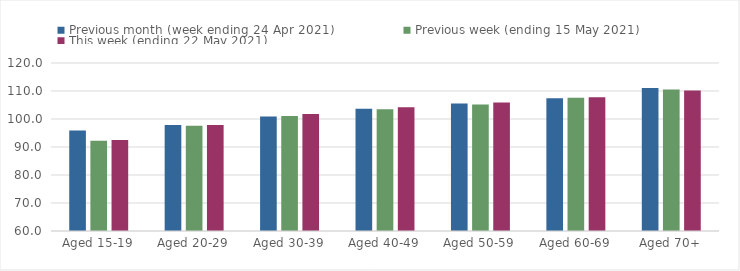
| Category | Previous month (week ending 24 Apr 2021) | Previous week (ending 15 May 2021) | This week (ending 22 May 2021) |
|---|---|---|---|
| Aged 15-19 | 95.92 | 92.24 | 92.48 |
| Aged 20-29 | 97.87 | 97.61 | 97.9 |
| Aged 30-39 | 100.9 | 101.09 | 101.81 |
| Aged 40-49 | 103.68 | 103.51 | 104.24 |
| Aged 50-59 | 105.57 | 105.22 | 105.86 |
| Aged 60-69 | 107.42 | 107.59 | 107.81 |
| Aged 70+ | 111.11 | 110.56 | 110.18 |